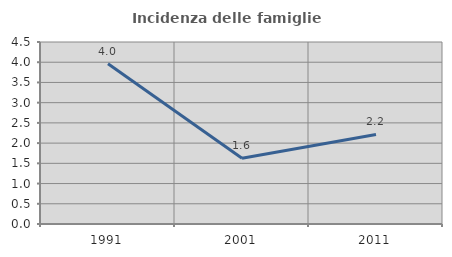
| Category | Incidenza delle famiglie numerose |
|---|---|
| 1991.0 | 3.96 |
| 2001.0 | 1.623 |
| 2011.0 | 2.214 |